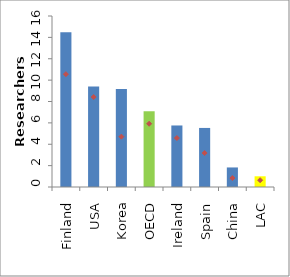
| Category | 2007 |
|---|---|
| Finland | 14.471 |
| USA | 9.395 |
| Korea | 9.165 |
| OECD | 7.087 |
| Ireland | 5.757 |
| Spain | 5.526 |
| China | 1.829 |
| LAC | 1.002 |